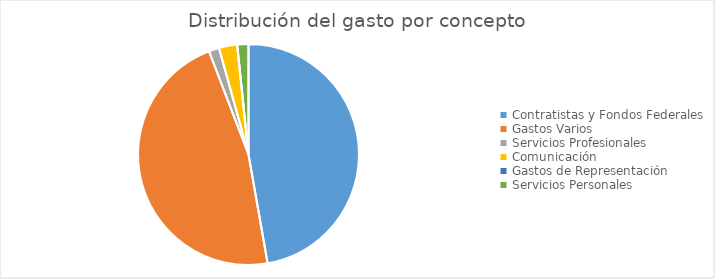
| Category | Series 0 |
|---|---|
| Contratistas y Fondos Federales | 241749701.76 |
| Gastos Varios | 240395642.74 |
| Servicios Profesionales | 7706691.01 |
| Comunicación | 13653070.51 |
| Gastos de Representación | 0 |
| Servicios Personales | 8388996.16 |